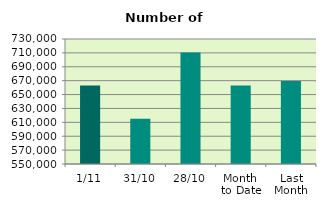
| Category | Series 0 |
|---|---|
| 1/11 | 662974 |
| 31/10 | 615250 |
| 28/10 | 710680 |
| Month 
to Date | 662974 |
| Last
Month | 669366.857 |